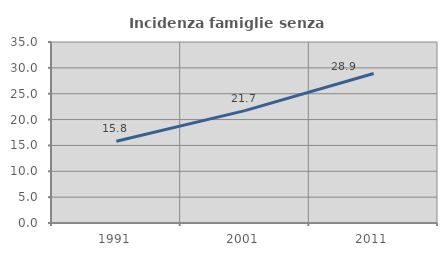
| Category | Incidenza famiglie senza nuclei |
|---|---|
| 1991.0 | 15.8 |
| 2001.0 | 21.735 |
| 2011.0 | 28.905 |